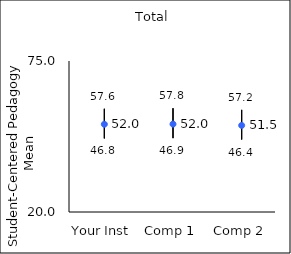
| Category | 25th percentile | 75th percentile | Mean |
|---|---|---|---|
| Your Inst | 46.8 | 57.6 | 51.96 |
| Comp 1 | 46.9 | 57.8 | 52.02 |
| Comp 2 | 46.4 | 57.2 | 51.54 |